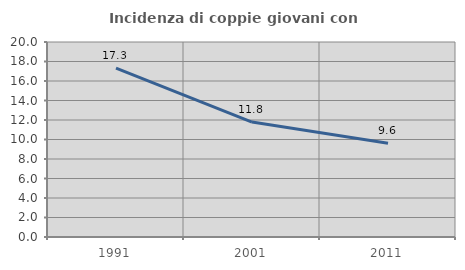
| Category | Incidenza di coppie giovani con figli |
|---|---|
| 1991.0 | 17.325 |
| 2001.0 | 11.788 |
| 2011.0 | 9.606 |